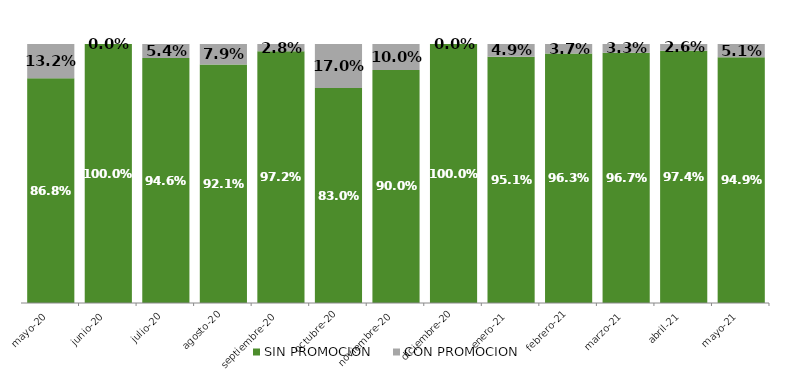
| Category | SIN PROMOCION   | CON PROMOCION   |
|---|---|---|
| 2020-05-01 | 0.868 | 0.132 |
| 2020-06-01 | 1 | 0 |
| 2020-07-01 | 0.946 | 0.054 |
| 2020-08-01 | 0.921 | 0.079 |
| 2020-09-01 | 0.972 | 0.028 |
| 2020-10-01 | 0.83 | 0.17 |
| 2020-11-01 | 0.9 | 0.1 |
| 2020-12-01 | 1 | 0 |
| 2021-01-01 | 0.951 | 0.049 |
| 2021-02-01 | 0.963 | 0.037 |
| 2021-03-01 | 0.967 | 0.033 |
| 2021-04-01 | 0.974 | 0.026 |
| 2021-05-01 | 0.949 | 0.051 |